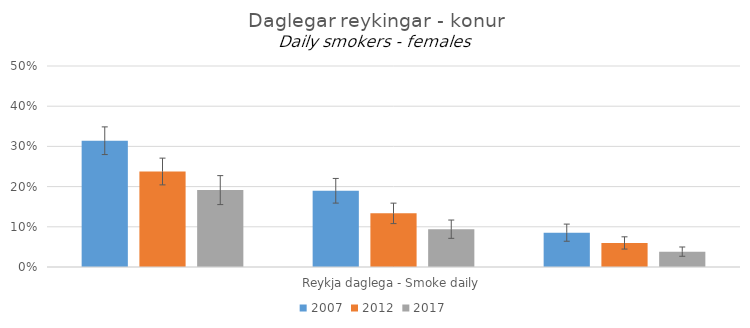
| Category | 2007 | 2012 | 2017 |
|---|---|---|---|
| 0 | 0.314 | 0.238 | 0.191 |
| 1 | 0.19 | 0.133 | 0.094 |
| 2 | 0.085 | 0.06 | 0.038 |